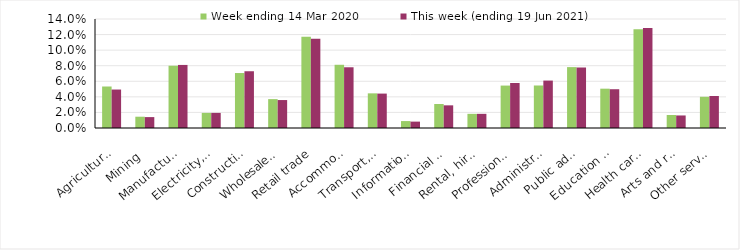
| Category | Week ending 14 Mar 2020 | This week (ending 19 Jun 2021) |
|---|---|---|
| Agriculture, forestry and fishing | 0.053 | 0.049 |
| Mining | 0.014 | 0.014 |
| Manufacturing | 0.08 | 0.081 |
| Electricity, gas, water and waste services | 0.019 | 0.019 |
| Construction | 0.071 | 0.073 |
| Wholesale trade | 0.037 | 0.036 |
| Retail trade | 0.117 | 0.114 |
| Accommodation and food services | 0.081 | 0.078 |
| Transport, postal and warehousing | 0.044 | 0.044 |
| Information media and telecommunications | 0.009 | 0.008 |
| Financial and insurance services | 0.031 | 0.029 |
| Rental, hiring and real estate services | 0.018 | 0.018 |
| Professional, scientific and technical services | 0.054 | 0.058 |
| Administrative and support services | 0.055 | 0.061 |
| Public administration and safety | 0.078 | 0.078 |
| Education and training | 0.05 | 0.05 |
| Health care and social assistance | 0.127 | 0.128 |
| Arts and recreation services | 0.017 | 0.016 |
| Other services | 0.04 | 0.041 |